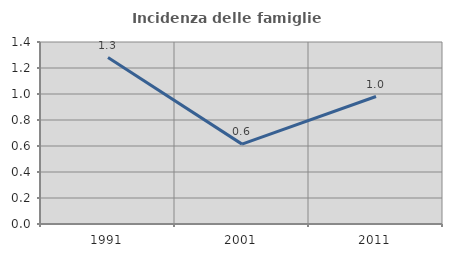
| Category | Incidenza delle famiglie numerose |
|---|---|
| 1991.0 | 1.281 |
| 2001.0 | 0.614 |
| 2011.0 | 0.981 |